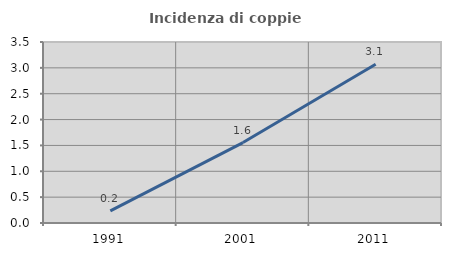
| Category | Incidenza di coppie miste |
|---|---|
| 1991.0 | 0.233 |
| 2001.0 | 1.555 |
| 2011.0 | 3.07 |